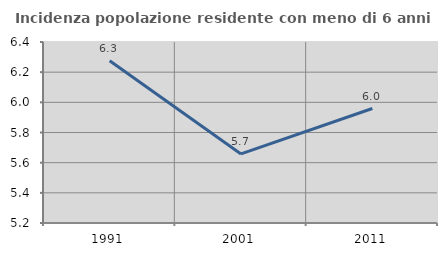
| Category | Incidenza popolazione residente con meno di 6 anni |
|---|---|
| 1991.0 | 6.276 |
| 2001.0 | 5.658 |
| 2011.0 | 5.959 |